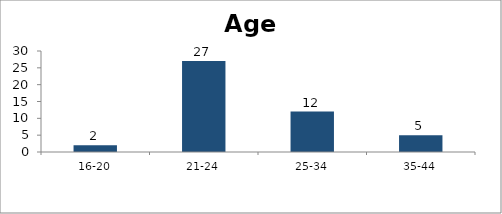
| Category | Age |
|---|---|
| 16-20 | 2 |
| 21-24 | 27 |
| 25-34 | 12 |
| 35-44 | 5 |